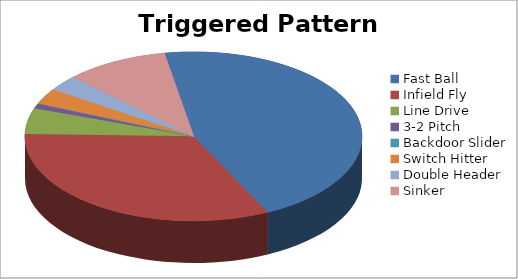
| Category | Series 1 |
|---|---|
| Fast Ball | 46 |
| Infield Fly | 33 |
| Line Drive | 5 |
| 3-2 Pitch | 1 |
| Backdoor Slider | 0 |
| Switch Hitter | 3 |
| Double Header | 3 |
| Sinker | 10 |